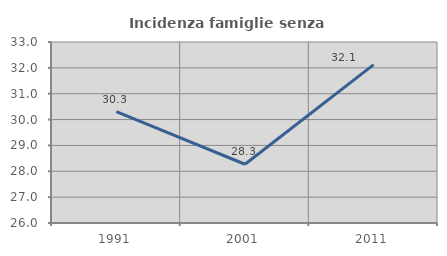
| Category | Incidenza famiglie senza nuclei |
|---|---|
| 1991.0 | 30.303 |
| 2001.0 | 28.272 |
| 2011.0 | 32.126 |